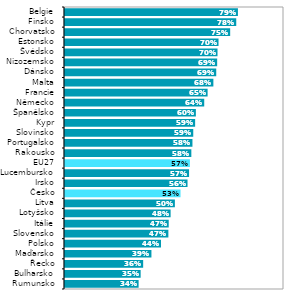
| Category | Series 1 |
|---|---|
| Rumunsko | 0.336 |
| Bulharsko | 0.345 |
| Řecko | 0.357 |
| Maďarsko | 0.395 |
| Polsko | 0.438 |
| Slovensko | 0.472 |
| Itálie | 0.474 |
| Lotyšsko | 0.482 |
| Litva | 0.502 |
| Česko | 0.528 |
| Irsko | 0.56 |
| Lucembursko | 0.567 |
| EU27 | 0.57 |
| Rakousko | 0.577 |
| Portugalsko | 0.582 |
| Slovinsko | 0.586 |
| Kypr | 0.594 |
| Španělsko | 0.598 |
| Německo | 0.636 |
| Francie | 0.651 |
| Malta | 0.677 |
| Dánsko | 0.691 |
| Nizozemsko | 0.695 |
| Švédsko | 0.696 |
| Estonsko | 0.701 |
| Chorvatsko | 0.754 |
| Finsko | 0.782 |
| Belgie | 0.79 |